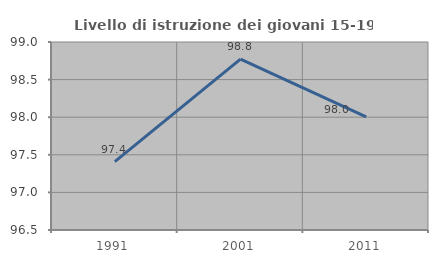
| Category | Livello di istruzione dei giovani 15-19 anni |
|---|---|
| 1991.0 | 97.409 |
| 2001.0 | 98.771 |
| 2011.0 | 98.006 |